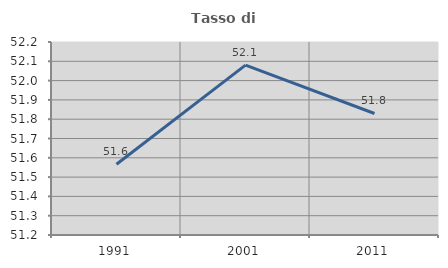
| Category | Tasso di occupazione   |
|---|---|
| 1991.0 | 51.567 |
| 2001.0 | 52.08 |
| 2011.0 | 51.83 |